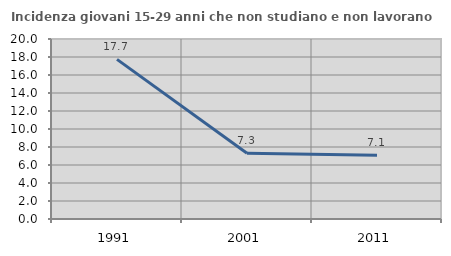
| Category | Incidenza giovani 15-29 anni che non studiano e non lavorano  |
|---|---|
| 1991.0 | 17.738 |
| 2001.0 | 7.306 |
| 2011.0 | 7.081 |